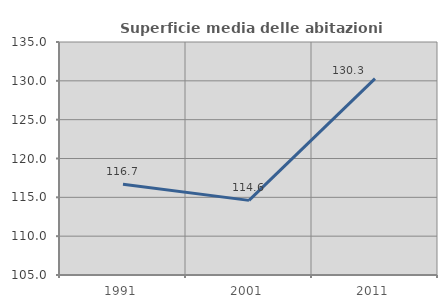
| Category | Superficie media delle abitazioni occupate |
|---|---|
| 1991.0 | 116.684 |
| 2001.0 | 114.608 |
| 2011.0 | 130.277 |